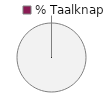
| Category | 1 - Taalknap |
|---|---|
| 0 | 0 |
| 1 | 1 |